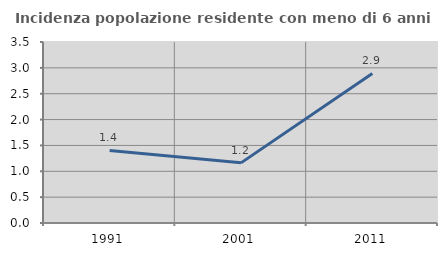
| Category | Incidenza popolazione residente con meno di 6 anni |
|---|---|
| 1991.0 | 1.404 |
| 2001.0 | 1.163 |
| 2011.0 | 2.893 |